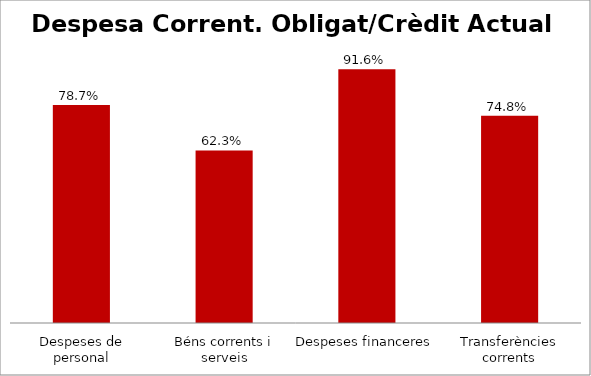
| Category | Series 0 |
|---|---|
| Despeses de personal | 0.787 |
| Béns corrents i serveis | 0.623 |
| Despeses financeres | 0.916 |
| Transferències corrents | 0.748 |